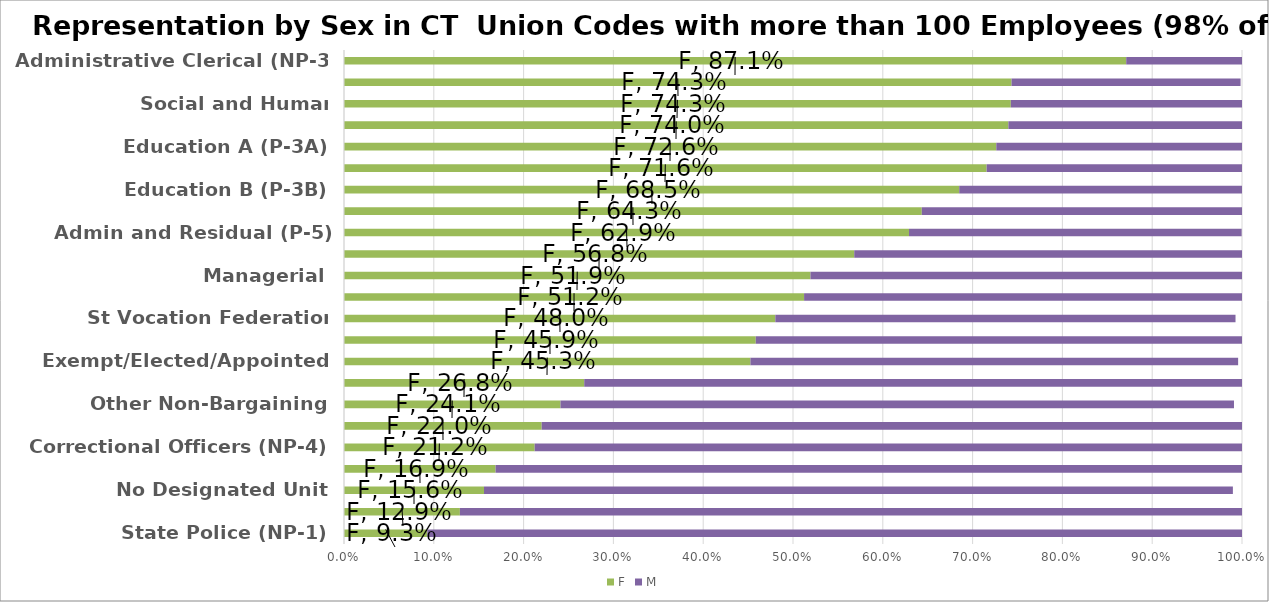
| Category | F | M |
|---|---|---|
| State Police (NP-1) | 0.093 | 0.907 |
| Service/Maintenance (NP-2) | 0.129 | 0.871 |
| No Designated Unit | 0.156 | 0.834 |
| Protective Services (NP-5) | 0.169 | 0.831 |
| Correctional Officers (NP-4) | 0.212 | 0.788 |
| Correctional Supervisor (NP-8) | 0.22 | 0.78 |
| Other Non-Bargaining | 0.241 | 0.75 |
| Engineer, Scien, Tech (P-4) | 0.268 | 0.732 |
| Exempt/Elected/Appointed | 0.453 | 0.543 |
| Conn Assoc Prosecutors | 0.459 | 0.541 |
| St Vocation Federation Teacher | 0.48 | 0.512 |
| DPDS Public Defenders - AFSCME | 0.512 | 0.488 |
| Managerial | 0.519 | 0.481 |
| Assistant Attys General | 0.568 | 0.432 |
| Admin and Residual (P-5) | 0.629 | 0.37 |
| Health NonProfessional (NP-6) | 0.643 | 0.357 |
| Education B (P-3B) | 0.685 | 0.315 |
| Criminal Justice Residual | 0.716 | 0.284 |
| Education A (P-3A) | 0.726 | 0.274 |
| Judicial - Non-Professional | 0.74 | 0.26 |
| Social and Human Services(P-2) | 0.743 | 0.257 |
| Health Professional (P-1) | 0.743 | 0.255 |
| Administrative Clerical (NP-3) | 0.871 | 0.129 |